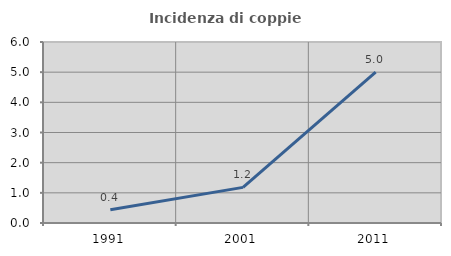
| Category | Incidenza di coppie miste |
|---|---|
| 1991.0 | 0.441 |
| 2001.0 | 1.181 |
| 2011.0 | 5 |